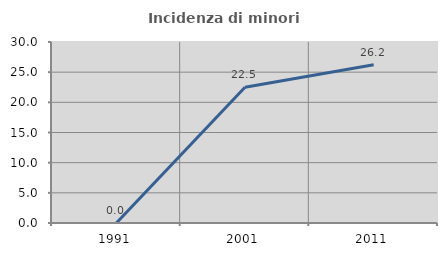
| Category | Incidenza di minori stranieri |
|---|---|
| 1991.0 | 0 |
| 2001.0 | 22.5 |
| 2011.0 | 26.214 |